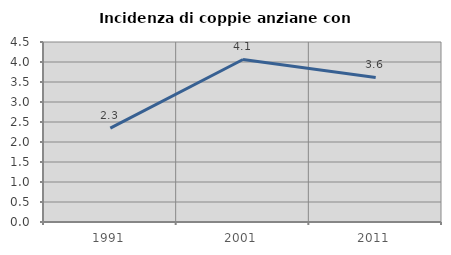
| Category | Incidenza di coppie anziane con figli |
|---|---|
| 1991.0 | 2.348 |
| 2001.0 | 4.063 |
| 2011.0 | 3.614 |